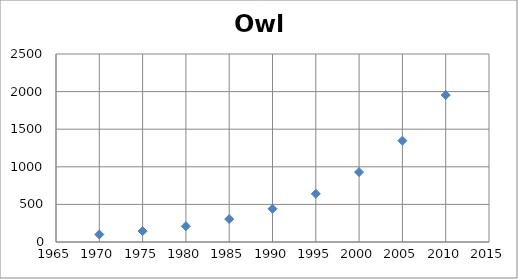
| Category | Series 0 |
|---|---|
| 1970.0 | 100 |
| 1975.0 | 145 |
| 1980.0 | 210.25 |
| 1985.0 | 304.862 |
| 1990.0 | 442.051 |
| 1995.0 | 640.973 |
| 2000.0 | 929.411 |
| 2005.0 | 1347.647 |
| 2010.0 | 1954.088 |